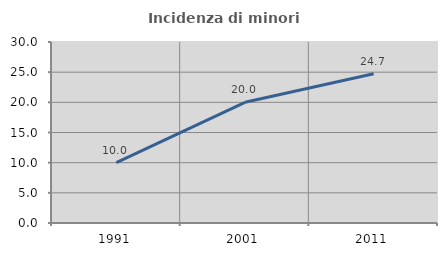
| Category | Incidenza di minori stranieri |
|---|---|
| 1991.0 | 10 |
| 2001.0 | 20 |
| 2011.0 | 24.733 |